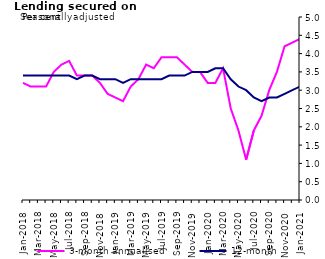
| Category | 3-month annualised | 12-month |
|---|---|---|
| Jan-2018 | 3.2 | 3.4 |
| Feb-2018 | 3.1 | 3.4 |
| Mar-2018 | 3.1 | 3.4 |
| Apr-2018 | 3.1 | 3.4 |
| May-2018 | 3.5 | 3.4 |
| Jun-2018 | 3.7 | 3.4 |
| Jul-2018 | 3.8 | 3.4 |
| Aug-2018 | 3.4 | 3.3 |
| Sep-2018 | 3.4 | 3.4 |
| Oct-2018 | 3.4 | 3.4 |
| Nov-2018 | 3.2 | 3.3 |
| Dec-2018 | 2.9 | 3.3 |
| Jan-2019 | 2.8 | 3.3 |
| Feb-2019 | 2.7 | 3.2 |
| Mar-2019 | 3.1 | 3.3 |
| Apr-2019 | 3.3 | 3.3 |
| May-2019 | 3.7 | 3.3 |
| Jun-2019 | 3.6 | 3.3 |
| Jul-2019 | 3.9 | 3.3 |
| Aug-2019 | 3.9 | 3.4 |
| Sep-2019 | 3.9 | 3.4 |
| Oct-2019 | 3.7 | 3.4 |
| Nov-2019 | 3.5 | 3.5 |
| Dec-2019 | 3.5 | 3.5 |
| Jan-2020 | 3.2 | 3.5 |
| Feb-2020 | 3.2 | 3.6 |
| Mar-2020 | 3.6 | 3.6 |
| Apr-2020 | 2.5 | 3.3 |
| May-2020 | 1.9 | 3.1 |
| Jun-2020 | 1.1 | 3 |
| Jul-2020 | 1.9 | 2.8 |
| Aug-2020 | 2.3 | 2.7 |
| Sep-2020 | 3 | 2.8 |
| Oct-2020 | 3.5 | 2.8 |
| Nov-2020 | 4.2 | 2.9 |
| Dec-2020 | 4.3 | 3 |
| Jan-2021 | 4.4 | 3.1 |